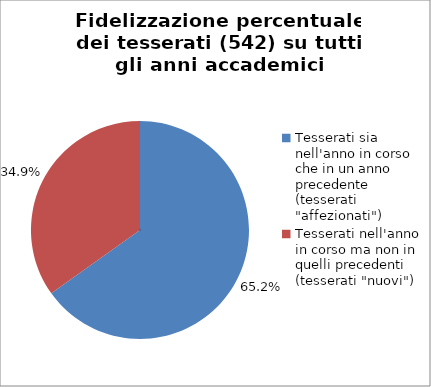
| Category | Nr. Tesserati |
|---|---|
| Tesserati sia nell'anno in corso che in un anno precedente (tesserati "affezionati") | 353 |
| Tesserati nell'anno in corso ma non in quelli precedenti (tesserati "nuovi") | 189 |